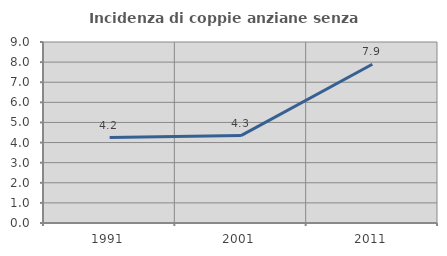
| Category | Incidenza di coppie anziane senza figli  |
|---|---|
| 1991.0 | 4.249 |
| 2001.0 | 4.348 |
| 2011.0 | 7.891 |